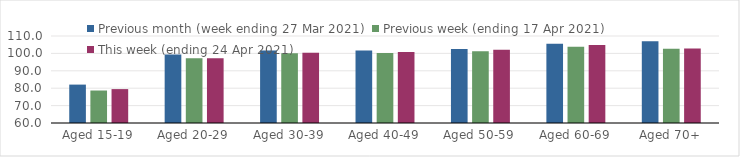
| Category | Previous month (week ending 27 Mar 2021) | Previous week (ending 17 Apr 2021) | This week (ending 24 Apr 2021) |
|---|---|---|---|
| Aged 15-19 | 82.07 | 78.67 | 79.48 |
| Aged 20-29 | 99.32 | 97.22 | 97.2 |
| Aged 30-39 | 101.66 | 100.1 | 100.41 |
| Aged 40-49 | 101.72 | 100.16 | 100.87 |
| Aged 50-59 | 102.6 | 101.21 | 102.09 |
| Aged 60-69 | 105.61 | 103.85 | 104.78 |
| Aged 70+ | 106.92 | 102.66 | 102.75 |